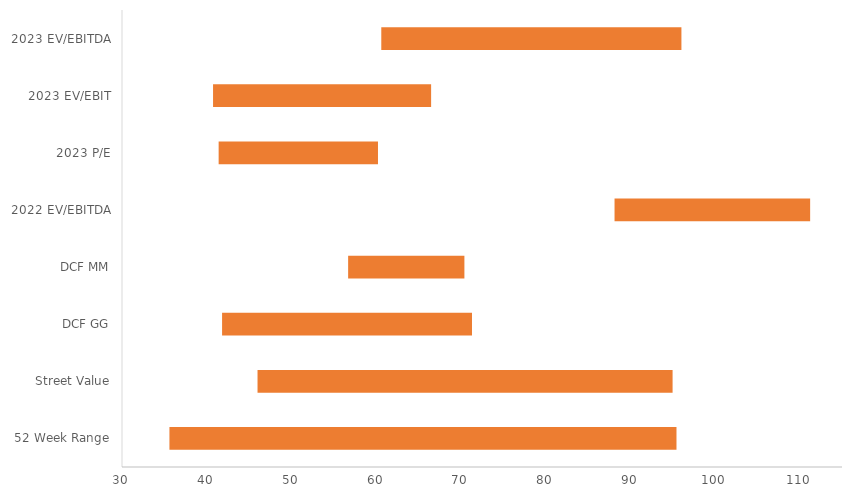
| Category | Series 0 | Series 1 | Series 2 |
|---|---|---|---|
| 52 Week Range | 35.6 | 59.86 | 95.46 |
| Street Value | 46 | 49 | 95 |
| DCF GG | 41.815 | 29.505 | 71.319 |
| DCF MM | 56.697 | 13.725 | 70.422 |
| 2022 EV/EBITDA | 88.147 | 23.092 | 111.239 |
| 2023 P/E | 41.41 | 18.811 | 60.221 |
| 2023 EV/EBIT | 40.748 | 25.745 | 66.493 |
| 2023 EV/EBITDA | 60.61 | 35.433 | 96.043 |